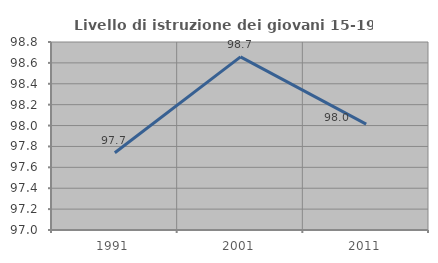
| Category | Livello di istruzione dei giovani 15-19 anni |
|---|---|
| 1991.0 | 97.74 |
| 2001.0 | 98.658 |
| 2011.0 | 98.013 |